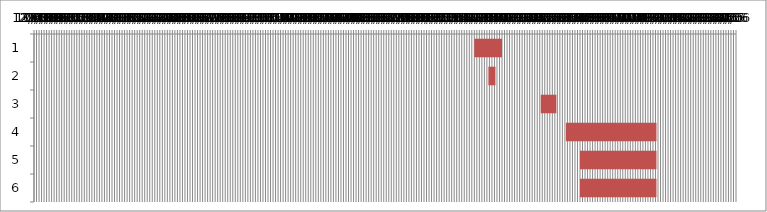
| Category | Fecha de inicio | DURACIÓN |
|---|---|---|
| 0 | 1/4/16 | 55 |
| 1 | 2/1/16 | 14 |
| 2 | 5/15/16 | 31 |
| 3 | 7/4/16 | 180 |
| 4 | 8/1/16 | 152 |
| 5 | 8/1/16 | 152 |